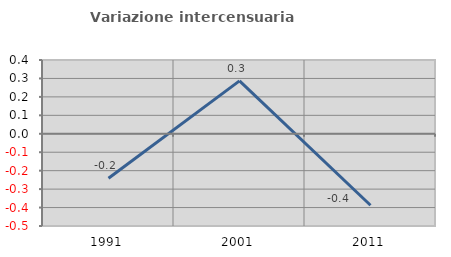
| Category | Variazione intercensuaria annua |
|---|---|
| 1991.0 | -0.241 |
| 2001.0 | 0.287 |
| 2011.0 | -0.388 |